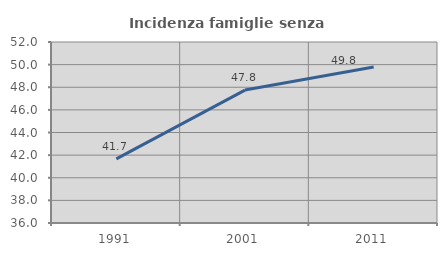
| Category | Incidenza famiglie senza nuclei |
|---|---|
| 1991.0 | 41.667 |
| 2001.0 | 47.752 |
| 2011.0 | 49.785 |